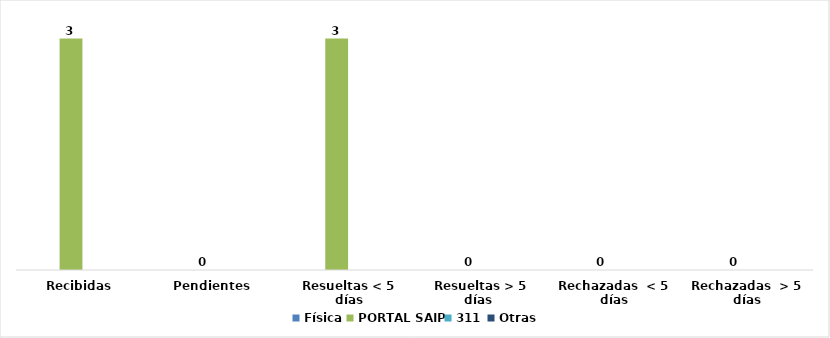
| Category | Física | PORTAL SAIP | 311 | Otras |
|---|---|---|---|---|
| Recibidas  | 0 | 3 | 0 | 0 |
| Pendientes  | 0 | 0 | 0 | 0 |
| Resueltas < 5 días | 0 | 3 | 0 | 0 |
| Resueltas > 5 días  | 0 | 0 | 0 | 0 |
| Rechazadas  < 5 días | 0 | 0 | 0 | 0 |
| Rechazadas  > 5 días | 0 | 0 | 0 | 0 |